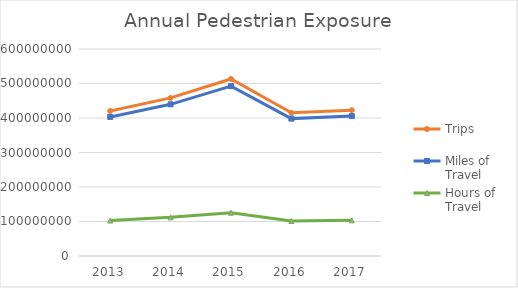
| Category | Trips | Miles of Travel | Hours of Travel |
|---|---|---|---|
| 2013 | 420195672.335 | 403152026.79 | 102794842.474 |
| 2014 | 458213545.796 | 439627849.245 | 112095369.755 |
| 2015 | 513110750.022 | 492298356.358 | 125525183.13 |
| 2016 | 415051771.042 | 398216768.366 | 101536460.825 |
| 2017 | 422650635.739 | 405507413.905 | 103395414.049 |